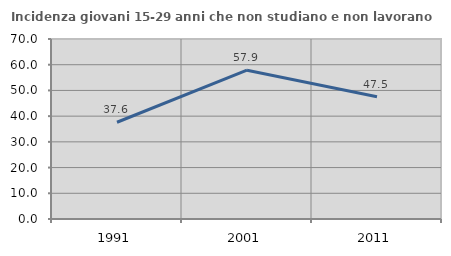
| Category | Incidenza giovani 15-29 anni che non studiano e non lavorano  |
|---|---|
| 1991.0 | 37.621 |
| 2001.0 | 57.874 |
| 2011.0 | 47.508 |